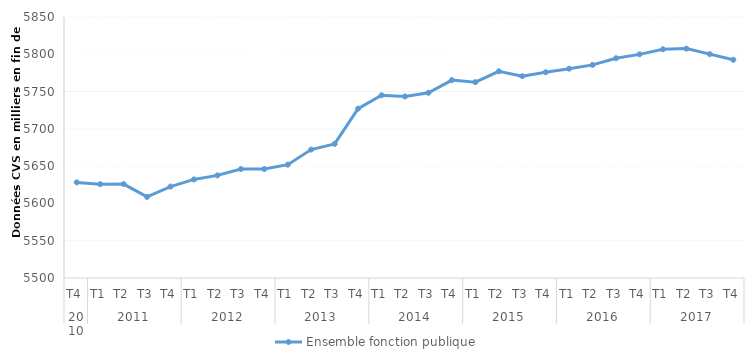
| Category | Ensemble fonction publique |
|---|---|
| 0 | 5628200 |
| 1 | 5625800 |
| 2 | 5625900 |
| 3 | 5608700 |
| 4 | 5622600 |
| 5 | 5632200 |
| 6 | 5637600 |
| 7 | 5646100 |
| 8 | 5646100 |
| 9 | 5652000 |
| 10 | 5672200 |
| 11 | 5679900 |
| 12 | 5727100 |
| 13 | 5745000 |
| 14 | 5743400 |
| 15 | 5748400 |
| 16 | 5765400 |
| 17 | 5762600 |
| 18 | 5777100 |
| 19 | 5770600 |
| 20 | 5775900 |
| 21 | 5780700 |
| 22 | 5785800 |
| 23 | 5794700 |
| 24 | 5799900 |
| 25 | 5806700 |
| 26 | 5807600 |
| 27 | 5800200 |
| 28 | 5792600 |